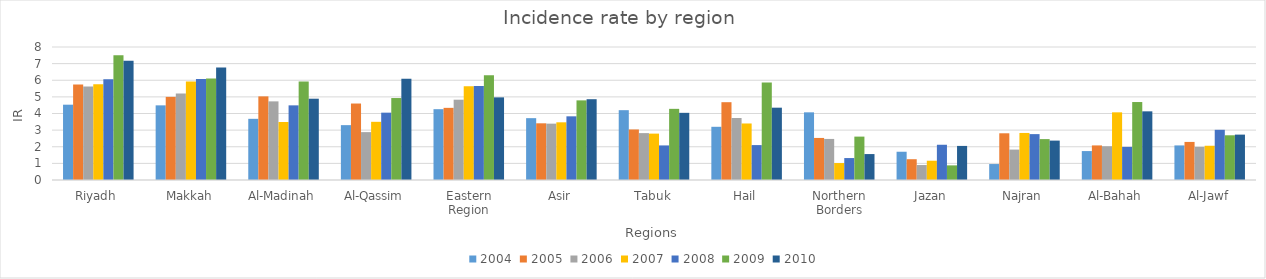
| Category | 2004 | 2005 | 2006 | 2007 | 2008 | 2009 | 2010 |
|---|---|---|---|---|---|---|---|
| Riyadh | 4.53 | 5.74 | 5.63 | 5.76 | 6.06 | 7.51 | 7.17 |
| Makkah | 4.49 | 5 | 5.21 | 5.92 | 6.08 | 6.1 | 6.77 |
| Al-Madinah | 3.68 | 5.03 | 4.73 | 3.49 | 4.49 | 5.93 | 4.89 |
| Al-Qassim | 3.3 | 4.6 | 2.88 | 3.5 | 4.05 | 4.93 | 6.09 |
| Eastern Region | 4.26 | 4.34 | 4.83 | 5.64 | 5.65 | 6.3 | 4.97 |
| Asir | 3.72 | 3.41 | 3.39 | 3.47 | 3.83 | 4.79 | 4.86 |
| Tabuk | 4.2 | 3.04 | 2.82 | 2.79 | 2.08 | 4.28 | 4.04 |
| Hail | 3.2 | 4.68 | 3.73 | 3.4 | 2.1 | 5.86 | 4.35 |
| Northern Borders | 4.07 | 2.53 | 2.47 | 1.02 | 1.32 | 2.61 | 1.56 |
| Jazan | 1.7 | 1.25 | 0.9 | 1.16 | 2.12 | 0.88 | 2.05 |
| Najran | 0.96 | 2.81 | 1.83 | 2.83 | 2.76 | 2.46 | 2.37 |
| Al-Bahah | 1.74 | 2.08 | 2.03 | 4.07 | 1.99 | 4.69 | 4.13 |
| Al-Jawf | 2.08 | 2.29 | 1.99 | 2.06 | 3.02 | 2.69 | 2.73 |